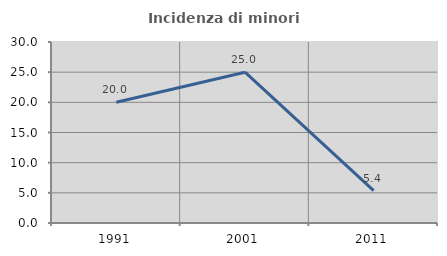
| Category | Incidenza di minori stranieri |
|---|---|
| 1991.0 | 20 |
| 2001.0 | 25 |
| 2011.0 | 5.357 |